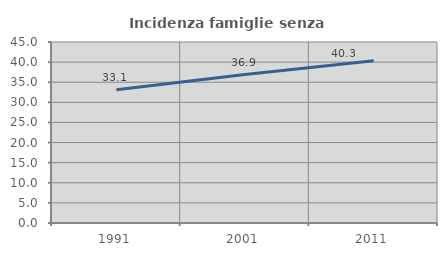
| Category | Incidenza famiglie senza nuclei |
|---|---|
| 1991.0 | 33.133 |
| 2001.0 | 36.898 |
| 2011.0 | 40.331 |